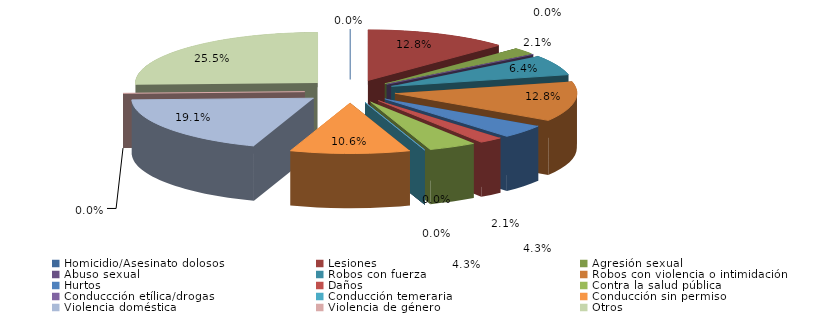
| Category | Series 0 |
|---|---|
| Homicidio/Asesinato dolosos | 0 |
| Lesiones | 6 |
| Agresión sexual | 1 |
| Abuso sexual | 0 |
| Robos con fuerza | 3 |
| Robos con violencia o intimidación | 6 |
| Hurtos | 2 |
| Daños | 1 |
| Contra la salud pública | 2 |
| Conduccción etílica/drogas | 0 |
| Conducción temeraria | 0 |
| Conducción sin permiso | 5 |
| Violencia doméstica | 9 |
| Violencia de género | 0 |
| Otros | 12 |